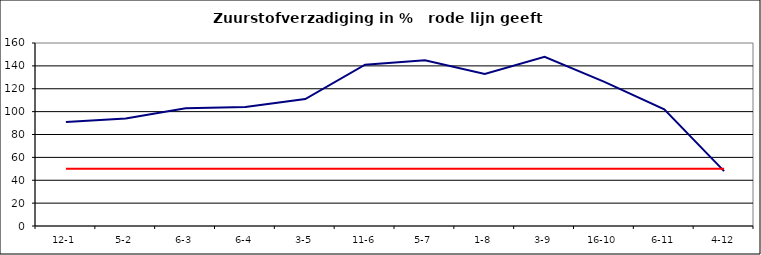
| Category | Series 0 | Series 1 |
|---|---|---|
| 12-1 | 91 | 50 |
| 5-2 | 94 | 50 |
| 6-3 | 103 | 50 |
| 6-4 | 104 | 50 |
| 3-5 | 111 | 50 |
| 11-6 | 141 | 50 |
| 5-7 | 145 | 50 |
| 1-8 | 133 | 50 |
| 3-9 | 148 | 50 |
| 16-10 | 126 | 50 |
| 6-11 | 102 | 50 |
| 4-12 | 48 | 50 |